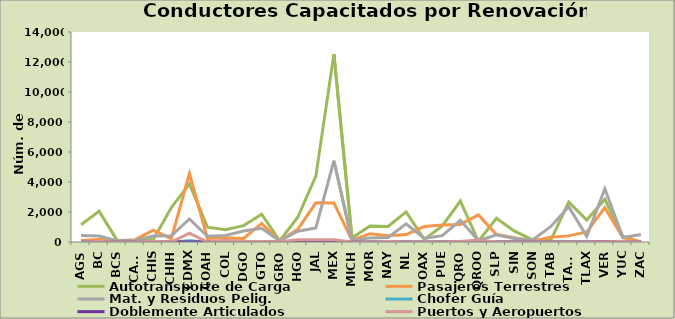
| Category | Autotransporte de Carga | Pasajeros Terrestres | Mat. y Residuos Pelig. | Chofer Guía | Doblemente Articulados | Puertos y Aeropuertos |
|---|---|---|---|---|---|---|
| AGS | 1154 | 95 | 428 | 0 | 0 | 0 |
| BC | 2049 | 171 | 404 | 6 | 0 | 36 |
| BCS | 106 | 82 | 85 | 0 | 0 | 7 |
| CAMP | 108 | 157 | 116 | 1 | 0 | 10 |
| CHIS | 168 | 781 | 399 | 0 | 0 | 41 |
| CHIH | 2300 | 216 | 411 | 0 | 0 | 0 |
| CDMX | 3874 | 4554 | 1534 | 89 | 0 | 590 |
| COAH | 989 | 243 | 381 | 0 | 0 | 0 |
| COL | 824 | 281 | 436 | 0 | 0 | 123 |
| DGO | 1092 | 236 | 731 | 0 | 0 | 27 |
| GTO | 1853 | 1236 | 914 | 0 | 0 | 41 |
| GRO | 83 | 61 | 73 | 0 | 0 | 18 |
| HGO | 1650 | 844 | 720 | 0 | 1 | 155 |
| JAL | 4390 | 2616 | 939 | 0 | 0 | 155 |
| MEX | 12531 | 2608 | 5419 | 0 | 1 | 142 |
| MICH | 275 | 121 | 95 | 0 | 0 | 0 |
| MOR | 1073 | 554 | 274 | 0 | 0 | 6 |
| NAY | 1040 | 411 | 299 | 0 | 0 | 30 |
| NL | 2006 | 496 | 1209 | 0 | 0 | 1 |
| OAX | 174 | 1029 | 246 | 0 | 1 | 9 |
| PUE | 1071 | 1136 | 426 | 0 | 0 | 4 |
| QRO | 2729 | 1171 | 1445 | 0 | 0 | 40 |
| QROO | 48 | 1805 | 93 | 0 | 0 | 136 |
| SLP | 1580 | 496 | 475 | 0 | 0 | 5 |
| SIN | 722 | 278 | 231 | 13 | 0 | 6 |
| SON | 148 | 55 | 129 | 0 | 0 | 3 |
| TAB | 108 | 310 | 1021 | 0 | 0 | 3 |
| TAMS | 2660 | 408 | 2348 | 0 | 1 | 3 |
| TLAX | 1464 | 676 | 374 | 0 | 0 | 5 |
| VER | 2848 | 2285 | 3548 | 20 | 38 | 21 |
| YUC | 371 | 291 | 300 | 0 | 0 | 29 |
| ZAC | 0 | 0 | 499 | 0 | 0 | 0 |